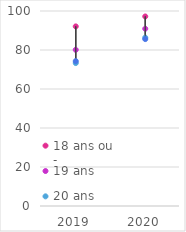
| Category | 18 ans ou - | 19 ans | 20 ans | 21 ans ou + |
|---|---|---|---|---|
| 2019.0 | 92.1 | 80.1 | 73.3 | 74.3 |
| 2020.0 | 97.2 | 90.9 | 86.4 | 85.6 |